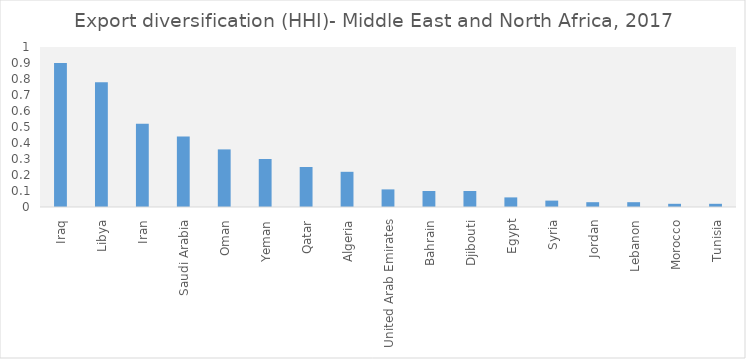
| Category | Series 0 |
|---|---|
| Iraq | 0.9 |
| Libya | 0.78 |
| Iran | 0.52 |
| Saudi Arabia | 0.44 |
| Oman | 0.36 |
| Yeman | 0.3 |
| Qatar | 0.25 |
| Algeria | 0.22 |
| United Arab Emirates | 0.11 |
| Bahrain | 0.1 |
| Djibouti | 0.1 |
| Egypt | 0.06 |
| Syria | 0.04 |
| Jordan | 0.03 |
| Lebanon | 0.03 |
| Morocco | 0.02 |
| Tunisia | 0.02 |